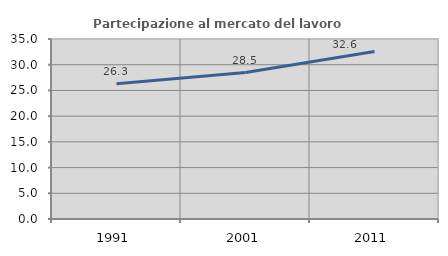
| Category | Partecipazione al mercato del lavoro  femminile |
|---|---|
| 1991.0 | 26.316 |
| 2001.0 | 28.481 |
| 2011.0 | 32.55 |